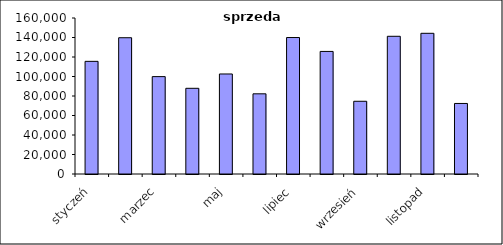
| Category | sprzedaż |
|---|---|
| styczeń | 115543.143 |
| luty | 139765.74 |
| marzec | 99875.55 |
| kwiecień | 87888.421 |
| maj | 102583.112 |
| czerwiec | 82232.977 |
| lipiec | 139978.965 |
| sierpień | 125715.23 |
| wrzesień | 74590.113 |
| październik | 141238.955 |
| listopad | 144308.665 |
| grudzień | 72352.837 |